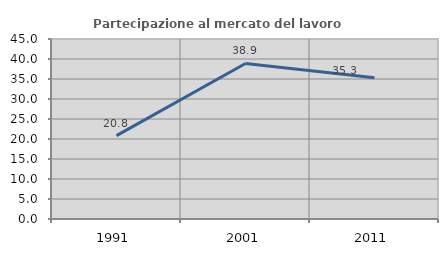
| Category | Partecipazione al mercato del lavoro  femminile |
|---|---|
| 1991.0 | 20.833 |
| 2001.0 | 38.889 |
| 2011.0 | 35.294 |